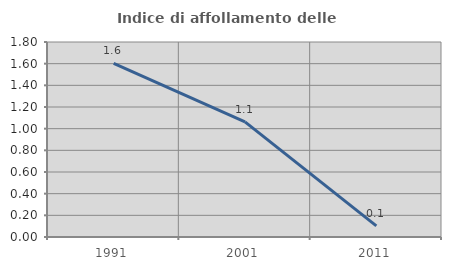
| Category | Indice di affollamento delle abitazioni  |
|---|---|
| 1991.0 | 1.603 |
| 2001.0 | 1.063 |
| 2011.0 | 0.103 |